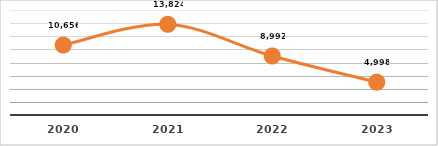
| Category | CERTIFICACIÓN DE COMPETENCIAS
PRIMER TRIMESTRE, EJERCICIO 2023 |
|---|---|
| 2020.0 | 10656 |
| 2021.0 | 13824 |
| 2022.0 | 8992 |
| 2023.0 | 4998 |